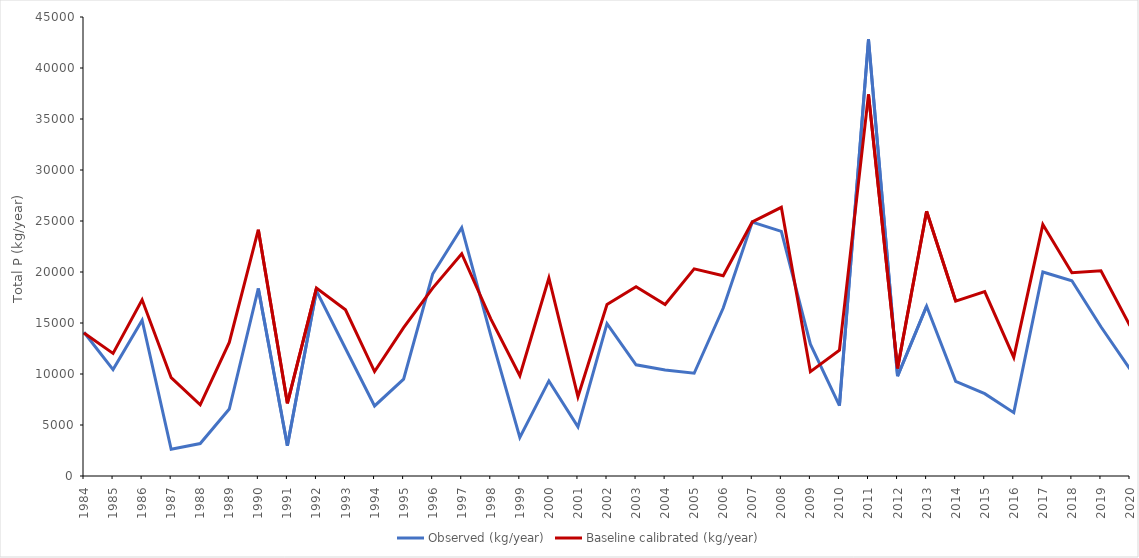
| Category | Observed (kg/year) | Baseline calibrated (kg/year) |
|---|---|---|
| 1984.0 | 14091.222 | 14010 |
| 1985.0 | 10436.02 | 12020 |
| 1986.0 | 15271.165 | 17280 |
| 1987.0 | 2623.469 | 9638 |
| 1988.0 | 3184.182 | 6975 |
| 1989.0 | 6570.498 | 13100 |
| 1990.0 | 18389.16 | 24150 |
| 1991.0 | 2969.08 | 7131 |
| 1992.0 | 18153.083 | 18430 |
| 1993.0 | 12500.193 | 16300 |
| 1994.0 | 6867.517 | 10240 |
| 1995.0 | 9501.466 | 14540 |
| 1996.0 | 19797.299 | 18420 |
| 1997.0 | 24342.25 | 21790 |
| 1998.0 | 13787.617 | 15410 |
| 1999.0 | 3773.579 | 9836 |
| 2000.0 | 9323.154 | 19410 |
| 2001.0 | 4818.544 | 7782 |
| 2002.0 | 14936.897 | 16820 |
| 2003.0 | 10904.803 | 18560 |
| 2004.0 | 10384.197 | 16810 |
| 2005.0 | 10074.26 | 20310 |
| 2006.0 | 16468.45 | 19630 |
| 2007.0 | 24893.949 | 24910 |
| 2008.0 | 23980.667 | 26340 |
| 2009.0 | 12920.165 | 10230 |
| 2010.0 | 6890.7 | 12340 |
| 2011.0 | 42815.641 | 37420 |
| 2012.0 | 9782.671 | 10550 |
| 2013.0 | 16649.916 | 25960 |
| 2014.0 | 9288.707 | 17150 |
| 2015.0 | 8071.832 | 18080 |
| 2016.0 | 6209.699 | 11630 |
| 2017.0 | 20003.039 | 24650 |
| 2018.0 | 19139.244 | 19920 |
| 2019.0 | 14632.481 | 20110 |
| 2020.0 | 10479.943 | 14730 |